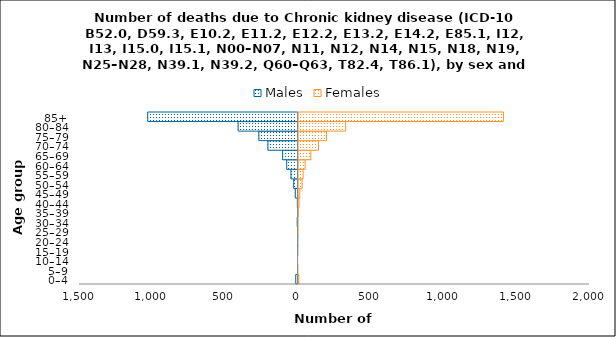
| Category | Males | Females |
|---|---|---|
| 0–4 | -16 | 8 |
| 5–9 | 0 | 1 |
| 10–14 | 0 | 0 |
| 15–19 | -1 | 0 |
| 20–24 | -1 | 0 |
| 25–29 | 0 | 3 |
| 30–34 | -6 | 1 |
| 35–39 | -3 | 4 |
| 40–44 | -5 | 10 |
| 45–49 | -19 | 15 |
| 50–54 | -30 | 31 |
| 55–59 | -49 | 38 |
| 60–64 | -78 | 52 |
| 65–69 | -106 | 91 |
| 70–74 | -207 | 144 |
| 75–79 | -269 | 199 |
| 80–84 | -411 | 330 |
| 85+ | -1032 | 1413 |